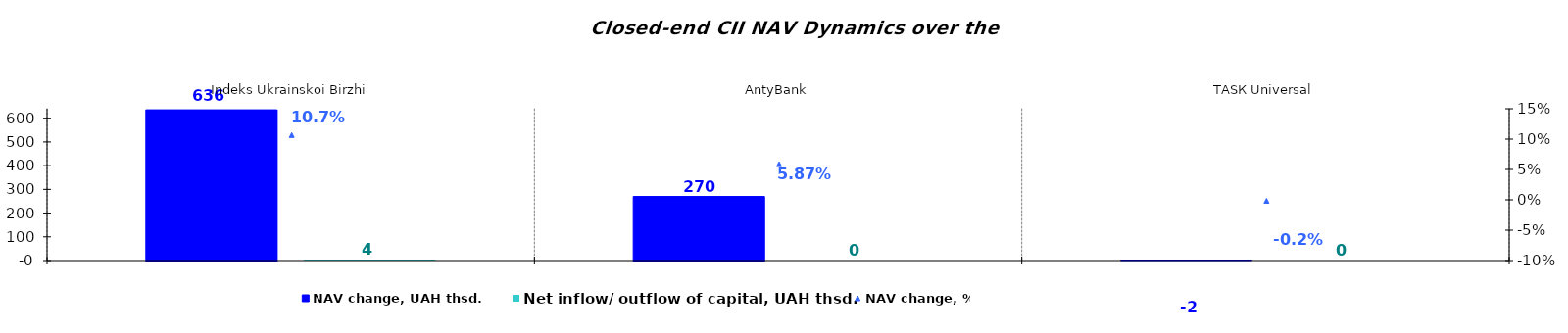
| Category | NAV change, UAH thsd. | Net inflow/ outflow of capital, UAH thsd. |
|---|---|---|
| Indeks Ukrainskoi Birzhi | 635.535 | 4.498 |
| AntyBank | 270.167 | 0 |
| ТАSК Universal | -1.759 | 0 |